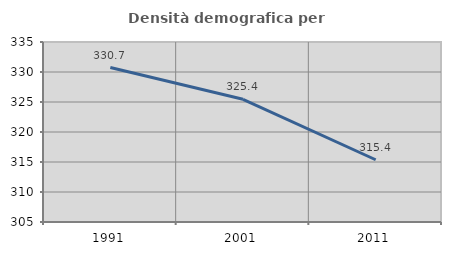
| Category | Densità demografica |
|---|---|
| 1991.0 | 330.743 |
| 2001.0 | 325.449 |
| 2011.0 | 315.376 |